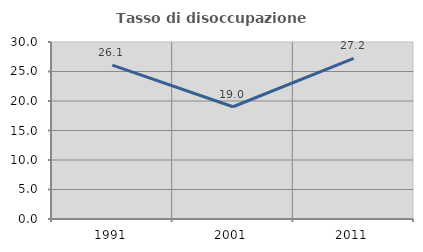
| Category | Tasso di disoccupazione giovanile  |
|---|---|
| 1991.0 | 26.083 |
| 2001.0 | 19.028 |
| 2011.0 | 27.218 |